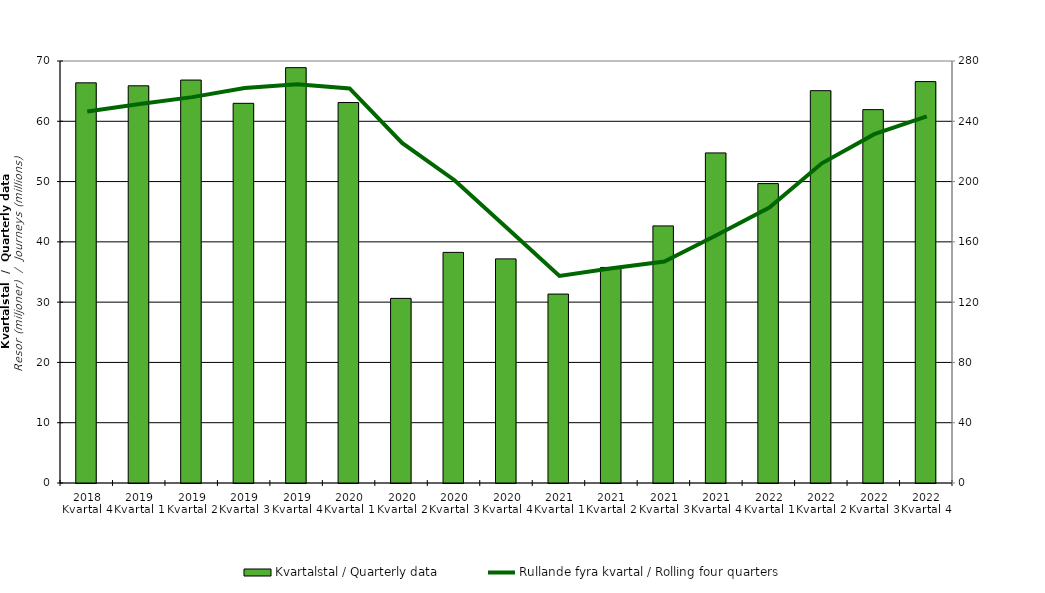
| Category | Kvartalstal / Quarterly data |
|---|---|
| 2018 Kvartal 4 | 66.378 |
| 2019 Kvartal 1 | 65.885 |
| 2019 Kvartal 2 | 66.84 |
| 2019 Kvartal 3 | 62.979 |
| 2019 Kvartal 4 | 68.898 |
| 2020 Kvartal 1 | 63.109 |
| 2020 Kvartal 2 | 30.624 |
| 2020 Kvartal 3 | 38.255 |
| 2020 Kvartal 4 | 37.175 |
| 2021 Kvartal 1 | 31.339 |
| 2021 Kvartal 2 | 35.757 |
| 2021 Kvartal 3 | 42.645 |
| 2021 Kvartal 4 | 54.75 |
| 2022 Kvartal 1 | 49.665 |
| 2022 Kvartal 2 | 65.076 |
| 2022 Kvartal 3 | 61.934 |
| 2022 Kvartal 4 | 66.586 |